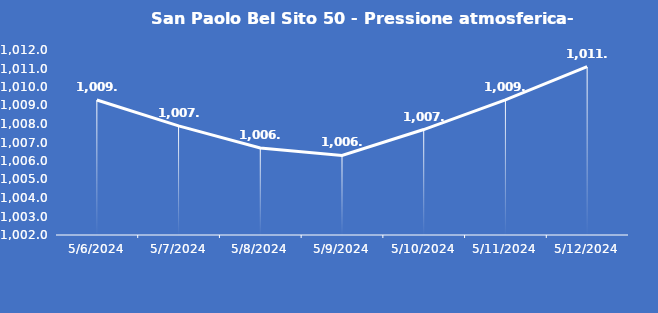
| Category | San Paolo Bel Sito 50 - Pressione atmosferica- Grezzo (hPa) |
|---|---|
| 5/6/24 | 1009.3 |
| 5/7/24 | 1007.9 |
| 5/8/24 | 1006.7 |
| 5/9/24 | 1006.3 |
| 5/10/24 | 1007.7 |
| 5/11/24 | 1009.3 |
| 5/12/24 | 1011.1 |